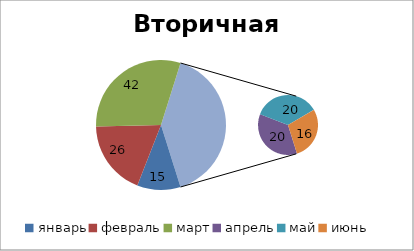
| Category | Филиал1 |
|---|---|
| январь | 15 |
| февраль | 26 |
| март | 42 |
| апрель | 20 |
| май | 20 |
| июнь | 16 |